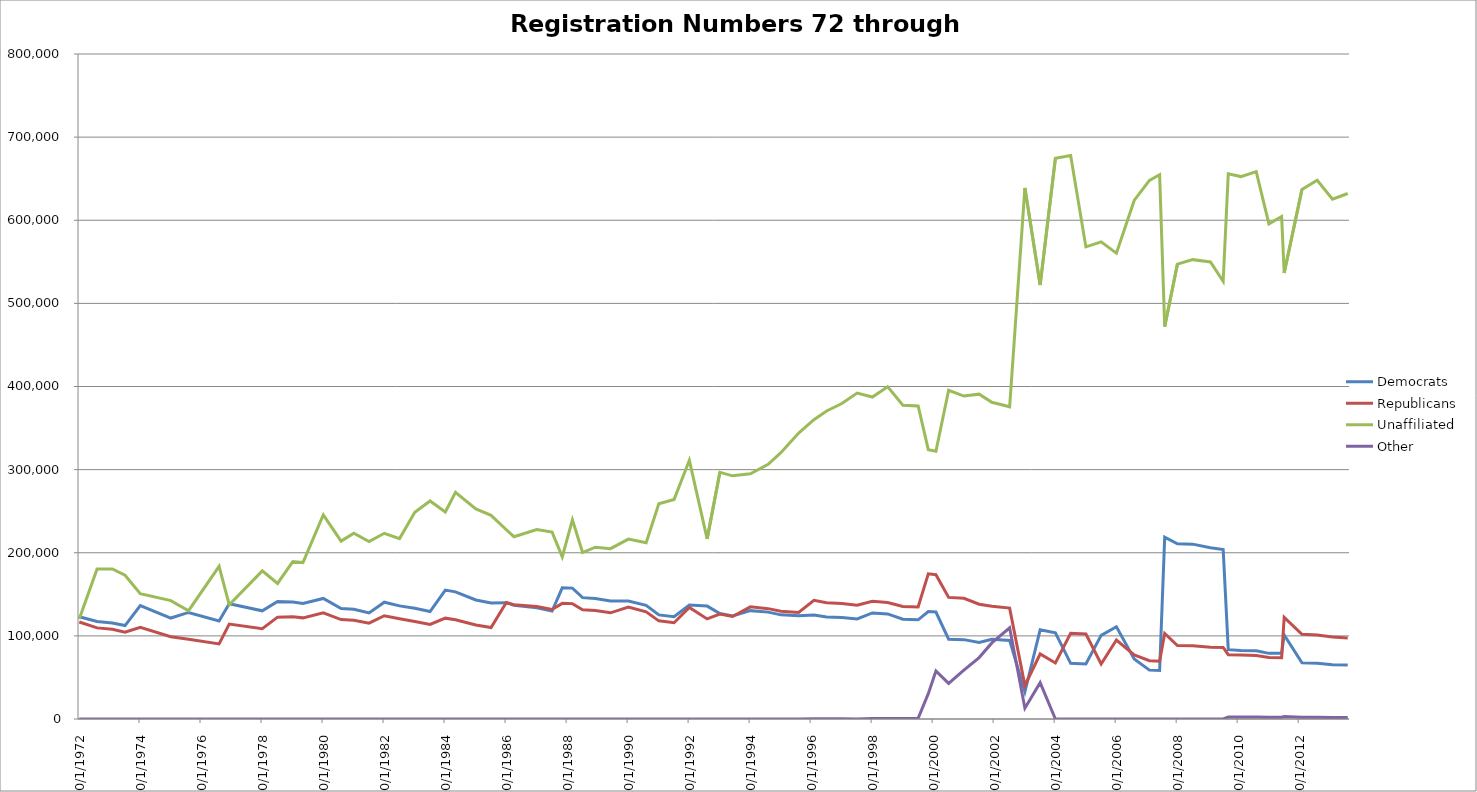
| Category | Democrats | Republicans | Unaffiliated | Other |
|---|---|---|---|---|
| 10/3/72 | 122986 | 116640 | 120434 | 0 |
| 5/16/73 | 117394 | 109613 | 180458 | 0 |
| 11/1/73 | 115497 | 107889 | 180553 | 0 |
| 4/17/74 | 112415 | 104364 | 172984 | 0 |
| 10/25/74 | 136544 | 110428 | 150857 | 0 |
| 10/17/75 | 121463 | 99043 | 142418 | 0 |
| 5/10/76 | 128189 | 95869 | 130286 | 0 |
| 5/3/77 | 117886 | 90369 | 183700 | 0 |
| 9/22/77 | 138637 | 114165 | 137316 | 0 |
| 10/5/78 | 130132 | 108636 | 178196 | 0 |
| 4/26/79 | 141373 | 122543 | 163076 | 0 |
| 10/25/79 | 140841 | 123067 | 189424 | 0 |
| 2/14/80 | 138961 | 121674 | 188177 | 0 |
| 10/31/80 | 145022 | 127736 | 245551 | 0 |
| 5/6/81 | 132939 | 119584 | 213971 | 0 |
| 10/14/81 | 132014 | 118670 | 223562 | 0 |
| 4/20/82 | 127639 | 115263 | 213368 | 0 |
| 10/25/82 | 140475 | 124241 | 223436 | 0 |
| 4/7/83 | 136095 | 120649 | 217024 | 0 |
| 10/17/83 | 133258 | 117348 | 248789 | 0 |
| 4/19/84 | 129295 | 113727 | 262323 | 0 |
| 10/3/84 | 155015 | 121301 | 248963 | 0 |
| 2/26/85 | 152912 | 119392 | 272689 | 0 |
| 10/15/85 | 143140 | 113154 | 252694 | 0 |
| 4/18/86 | 139669 | 110000 | 245038 | 0 |
| 10/21/86 | 139965 | 140162 | 227649 | 0 |
| 1/30/87 | 136918 | 137528 | 219308 | 0 |
| 10/21/87 | 133714 | 135362 | 227851 | 0 |
| 4/25/88 | 129770 | 131788 | 224829 | 0 |
| 8/25/88 | 157743 | 139090 | 195132 | 0 |
| 12/1/88 | 157444 | 138806 | 239549 | 0 |
| 4/6/89 | 145999 | 131382 | 200225 | 0 |
| 9/25/89 | 144951 | 130569 | 206717 | 0 |
| 3/9/90 | 141868 | 127737 | 204951 | 0 |
| 10/24/90 | 142052 | 134637 | 216383 | 0 |
| 5/1/91 | 136806 | 128862 | 212137 | 0 |
| 10/25/91 | 125267 | 118060 | 258848 | 0 |
| 4/14/92 | 122998 | 115807 | 264190 | 0 |
| 10/26/92 | 137049 | 134254 | 311191 | 0 |
| 5/2/93 | 135824 | 120431 | 216710 | 0 |
| 10/14/93 | 126929 | 126229 | 296642 | 0 |
| 3/30/94 | 124023 | 123363 | 292522 | 0 |
| 10/24/94 | 130362 | 134969 | 294967 | 0 |
| 5/9/95 | 128580 | 132770 | 306417 | 0 |
| 10/22/95 | 125287 | 129630 | 320343 | 0 |
| 5/1/96 | 124185 | 128238 | 343984 | 0 |
| 11/1/96 | 124990 | 142734 | 360074 | 319 |
| 4/30/97 | 122800 | 139932 | 370505 | 318 |
| 10/31/97 | 122042 | 138923 | 379544 | 304 |
| 4/20/98 | 120374 | 136829 | 392035 | 0 |
| 10/30/98 | 127569 | 141629 | 387332 | 702 |
| 4/16/99 | 126424 | 140067 | 399804 | 700 |
| 10/30/99 | 120081 | 135390 | 377365 | 685 |
| 4/28/00 | 119287 | 134825 | 376559 | 819 |
| 8/30/00 | 129347 | 174713 | 323981 | 30481 |
| 11/30/00 | 128706 | 173633 | 322066 | 57810 |
| 4/30/01 | 95992 | 146308 | 395487 | 42841 |
| 10/17/01 | 95484 | 145239 | 388472 | 58662 |
| 4/30/02 | 92015 | 138036 | 390779 | 73921 |
| 9/30/02 | 95860 | 135672 | 381035 | 91545 |
| 4/30/03 | 94557 | 133401 | 375549 | 109690 |
| 10/31/03 | 32751 | 40306 | 638879 | 13020 |
| 4/29/04 | 107281 | 78228 | 522170 | 43720 |
| 10/20/04 | 103744 | 67405 | 674569 | 0 |
| 4/29/05 | 66920 | 103074 | 677838 | 0 |
| 10/20/05 | 66290 | 102219 | 567938 | 0 |
| 4/28/06 | 100616 | 66219 | 573984 | 0 |
| 10/26/06 | 111013 | 95059 | 560418 | 0 |
| 5/1/07 | 72327 | 77013 | 623843 | 0 |
| 11/1/07 | 58803 | 70108 | 647880 | 0 |
| 3/1/08 | 58315 | 69489 | 654776 | 0 |
| 5/1/08 | 218759 | 102848 | 472041 | 0 |
| 10/28/08 | 210728 | 88374 | 547236 | 0 |
| 4/28/09 | 210349 | 88239 | 552601 | 0 |
| 11/1/09 | 206097 | 86226 | 549859 | 0 |
| 4/28/10 | 203856 | 86045 | 526533 | 0 |
| 6/1/10 | 83455 | 77350 | 655959 | 2323 |
| 11/1/10 | 82386 | 76916 | 652531 | 2312 |
| 5/1/11 | 81966 | 76306 | 658443 | 2309 |
| 10/22/11 | 78963 | 73934 | 595691 | 2187 |
| 3/1/12 | 79206 | 73649 | 604470 | 2204 |
| 4/1/12 | 101090 | 122321 | 536491 | 3047 |
| 11/1/12 | 67590 | 101868 | 637142 | 1978 |
| 5/1/13 | 67178 | 101112 | 648066 | 1960 |
| 11/1/13 | 65410 | 98582 | 625271 | 1883 |
| 5/1/14 | 64876 | 97531 | 632182 | 1874 |